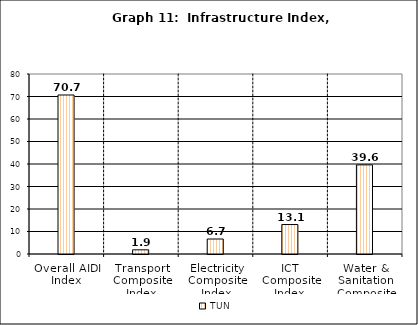
| Category | Series 0 | TUN | Series 2 |
|---|---|---|---|
| Overall AIDI Index |  | 70.669 |  |
| Transport Composite Index |  | 1.859 |  |
| Electricity Composite Index |  | 6.667 |  |
| ICT Composite Index  |  | 13.092 |  |
| Water & Sanitation Composite Index |  | 39.617 |  |